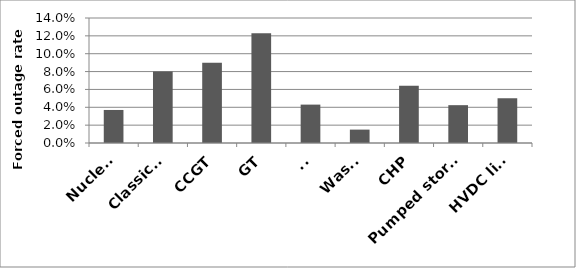
| Category | Series 0 |
|---|---|
| Nuclear | 0.037 |
| Classical | 0.08 |
| CCGT | 0.09 |
| GT | 0.123 |
| TJ | 0.043 |
| Waste | 0.015 |
| CHP | 0.064 |
| Pumped storage | 0.042 |
| HVDC link | 0.05 |